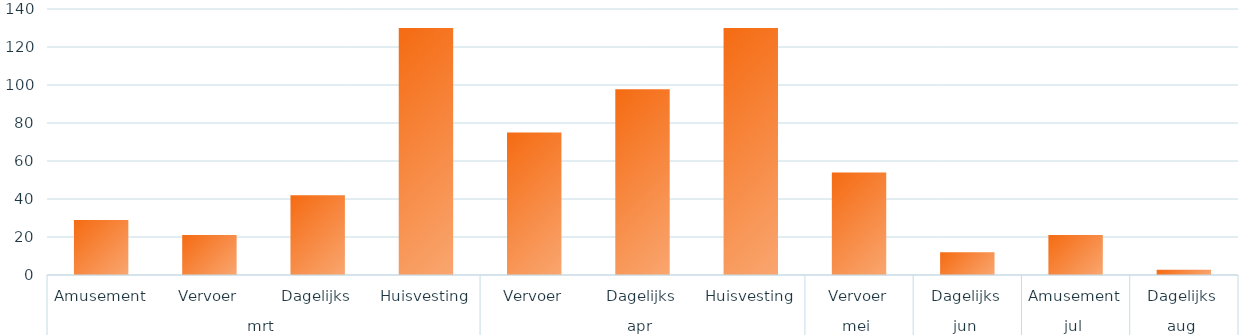
| Category | Totaal |
|---|---|
| 0 | 29 |
| 1 | 21 |
| 2 | 42 |
| 3 | 130 |
| 4 | 75 |
| 5 | 97.75 |
| 6 | 130 |
| 7 | 54 |
| 8 | 12 |
| 9 | 21 |
| 10 | 2.75 |